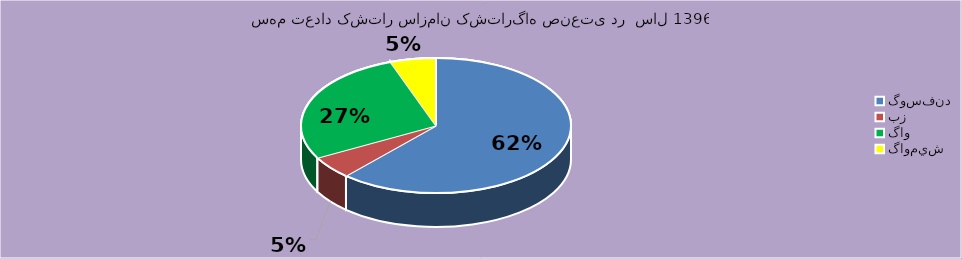
| Category | Series 0 |
|---|---|
| گوسفند | 23981 |
| بز | 2116 |
| گاو | 10695 |
| گاوميش | 2127 |